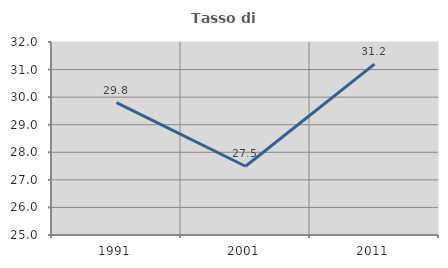
| Category | Tasso di occupazione   |
|---|---|
| 1991.0 | 29.799 |
| 2001.0 | 27.494 |
| 2011.0 | 31.195 |